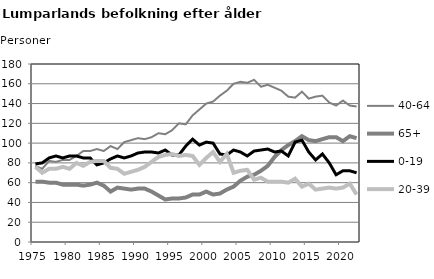
| Category | 40-64 | 65+ | 0-19 | 20-39 |
|---|---|---|---|---|
| 1975.0 | 77 | 61 | 79 | 76 |
| 1976.0 | 74 | 61 | 80 | 70 |
| 1977.0 | 82 | 60 | 85 | 74 |
| 1978.0 | 81 | 60 | 87 | 74 |
| 1979.0 | 83 | 58 | 85 | 76 |
| 1980.0 | 83 | 58 | 87 | 74 |
| 1981.0 | 87 | 58 | 87 | 80 |
| 1982.0 | 92 | 57 | 85 | 77 |
| 1983.0 | 92 | 58 | 85 | 81 |
| 1984.0 | 94 | 60 | 78 | 82 |
| 1985.0 | 92 | 57 | 80 | 82 |
| 1986.0 | 97 | 51 | 84 | 75 |
| 1987.0 | 94 | 55 | 87 | 74 |
| 1988.0 | 101 | 54 | 85 | 69 |
| 1989.0 | 103 | 53 | 87 | 71 |
| 1990.0 | 105 | 54 | 90 | 73 |
| 1991.0 | 104 | 54 | 91 | 76 |
| 1992.0 | 106 | 51 | 91 | 81 |
| 1993.0 | 110 | 47 | 90 | 86 |
| 1994.0 | 109 | 43 | 93 | 88 |
| 1995.0 | 113 | 44 | 88 | 89 |
| 1996.0 | 120 | 44 | 88 | 87 |
| 1997.0 | 119 | 45 | 97 | 88 |
| 1998.0 | 128 | 48 | 104 | 87 |
| 1999.0 | 134 | 48 | 98 | 78 |
| 2000.0 | 140 | 51 | 101 | 85 |
| 2001.0 | 142 | 48 | 100 | 91 |
| 2002.0 | 148 | 49 | 89 | 81 |
| 2003.0 | 153 | 53 | 88 | 89 |
| 2004.0 | 160 | 56 | 93 | 70 |
| 2005.0 | 162 | 62 | 91 | 72 |
| 2006.0 | 161 | 66 | 87 | 73 |
| 2007.0 | 164 | 68 | 92 | 63 |
| 2008.0 | 157 | 72 | 93 | 65 |
| 2009.0 | 159 | 77 | 94 | 61 |
| 2010.0 | 156 | 86 | 91 | 61 |
| 2011.0 | 153 | 93 | 92 | 61 |
| 2012.0 | 147 | 98 | 87 | 60 |
| 2013.0 | 146 | 102 | 101 | 64 |
| 2014.0 | 152 | 107 | 103 | 56 |
| 2015.0 | 145 | 103 | 91 | 59 |
| 2016.0 | 147 | 102 | 83 | 53 |
| 2017.0 | 148 | 104 | 89 | 54 |
| 2018.0 | 141 | 106 | 80 | 55 |
| 2019.0 | 138 | 106 | 68 | 54 |
| 2020.0 | 143 | 102 | 72 | 55 |
| 2021.0 | 138 | 107 | 72 | 59 |
| 2022.0 | 137 | 105 | 70 | 48 |